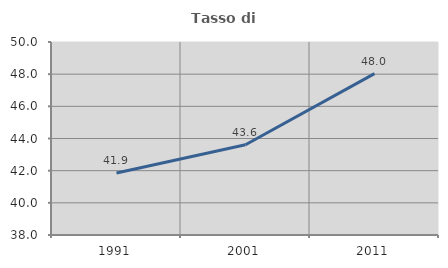
| Category | Tasso di occupazione   |
|---|---|
| 1991.0 | 41.854 |
| 2001.0 | 43.612 |
| 2011.0 | 48.03 |